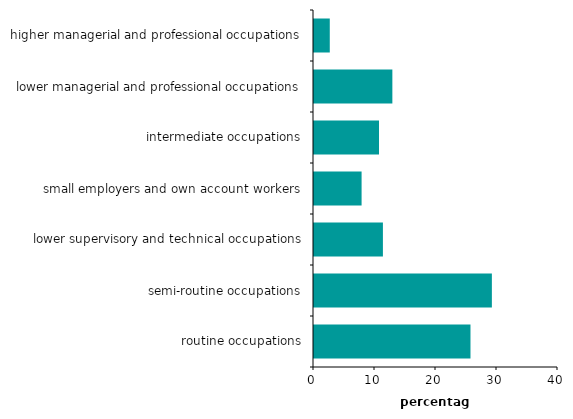
| Category | Series 0 |
|---|---|
| higher managerial and professional occupations | 2.587 |
| lower managerial and professional occupations | 12.846 |
| intermediate occupations | 10.657 |
| small employers and own account workers | 7.802 |
| lower supervisory and technical occupations | 11.297 |
| semi-routine occupations | 29.159 |
| routine occupations | 25.652 |